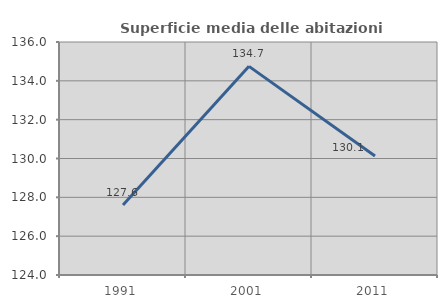
| Category | Superficie media delle abitazioni occupate |
|---|---|
| 1991.0 | 127.606 |
| 2001.0 | 134.745 |
| 2011.0 | 130.131 |